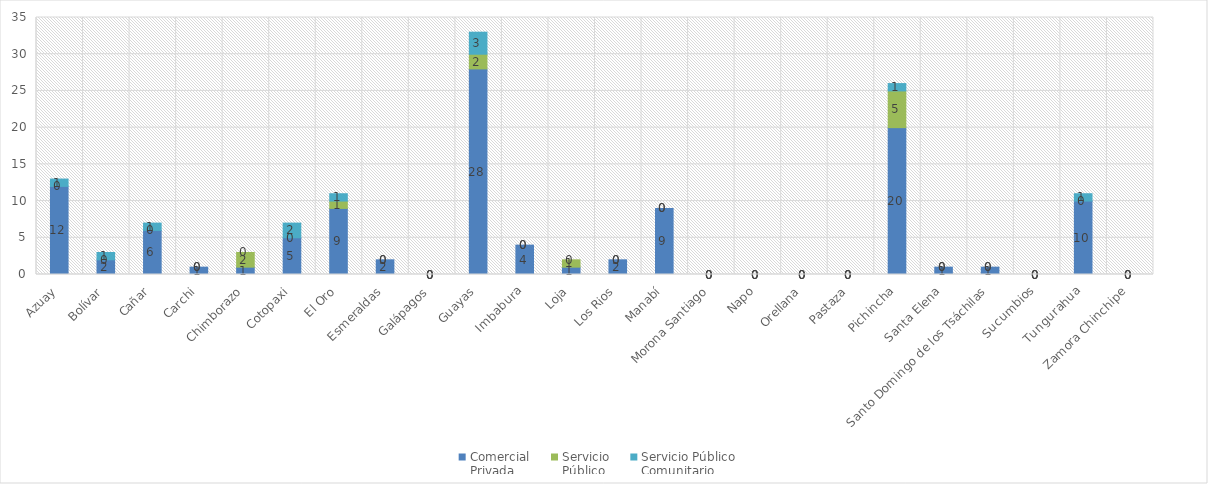
| Category | Comercial 
Privada | Servicio 
Público | Servicio Público
Comunitario |
|---|---|---|---|
| Azuay | 12 | 0 | 1 |
| Bolívar | 2 | 0 | 1 |
| Cañar | 6 | 0 | 1 |
| Carchi | 1 | 0 | 0 |
| Chimborazo | 1 | 2 | 0 |
| Cotopaxi | 5 | 0 | 2 |
| El Oro | 9 | 1 | 1 |
| Esmeraldas | 2 | 0 | 0 |
| Galápagos | 0 | 0 | 0 |
| Guayas | 28 | 2 | 3 |
| Imbabura | 4 | 0 | 0 |
| Loja | 1 | 1 | 0 |
| Los Rios | 2 | 0 | 0 |
| Manabí | 9 | 0 | 0 |
| Morona Santiago | 0 | 0 | 0 |
| Napo | 0 | 0 | 0 |
| Orellana | 0 | 0 | 0 |
| Pastaza | 0 | 0 | 0 |
| Pichincha | 20 | 5 | 1 |
| Santa Elena | 1 | 0 | 0 |
| Santo Domingo de los Tsáchilas | 1 | 0 | 0 |
| Sucumbios | 0 | 0 | 0 |
| Tungurahua | 10 | 0 | 1 |
| Zamora Chinchipe | 0 | 0 | 0 |